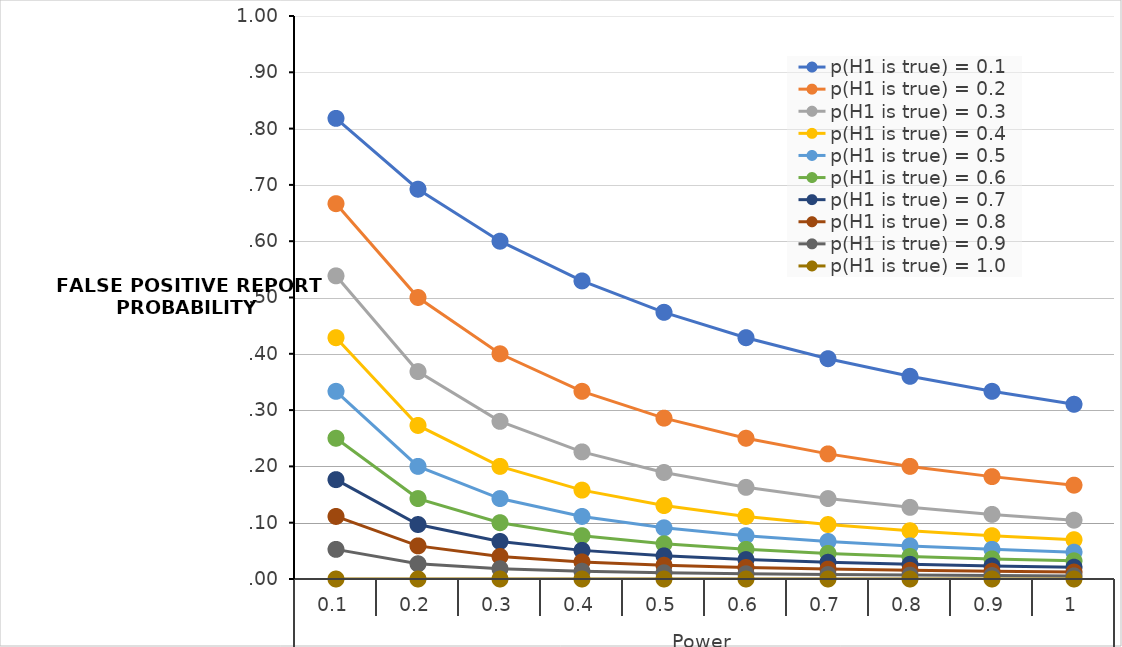
| Category | p(H1 is true) = |
|---|---|
| 0 | 0 |
| 1 | 0 |
| 2 | 0 |
| 3 | 0 |
| 4 | 0 |
| 5 | 0 |
| 6 | 0 |
| 7 | 0 |
| 8 | 0 |
| 9 | 0 |